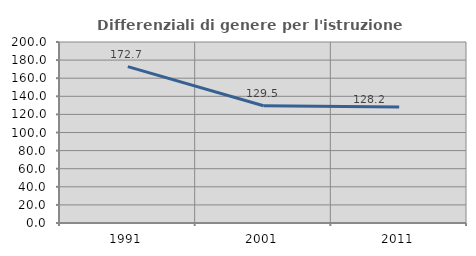
| Category | Differenziali di genere per l'istruzione superiore |
|---|---|
| 1991.0 | 172.748 |
| 2001.0 | 129.529 |
| 2011.0 | 128.179 |